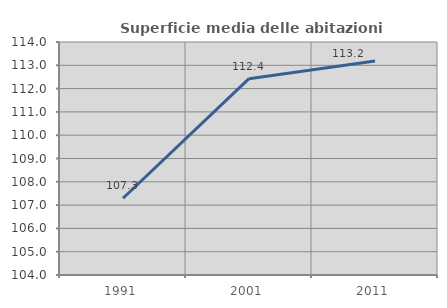
| Category | Superficie media delle abitazioni occupate |
|---|---|
| 1991.0 | 107.294 |
| 2001.0 | 112.425 |
| 2011.0 | 113.183 |